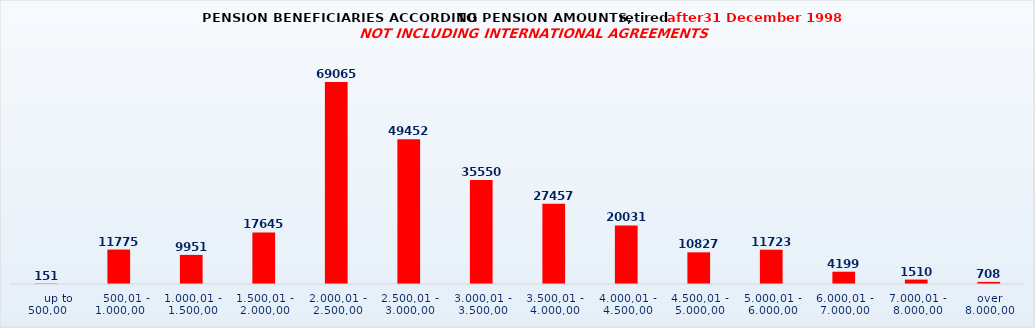
| Category | Series 0 |
|---|---|
|      up to 500,00 | 151 |
|    500,01 - 1.000,00 | 11775 |
| 1.000,01 - 1.500,00 | 9951 |
| 1.500,01 - 2.000,00 | 17645 |
| 2.000,01 - 2.500,00 | 69065 |
| 2.500,01 - 3.000,00 | 49452 |
| 3.000,01 - 3.500,00 | 35550 |
| 3.500,01 - 4.000,00 | 27457 |
| 4.000,01 - 4.500,00 | 20031 |
| 4.500,01 - 5.000,00 | 10827 |
| 5.000,01 - 6.000,00 | 11723 |
| 6.000,01 - 7.000,00 | 4199 |
| 7.000,01 - 8.000,00 | 1510 |
| over 8.000,00 | 708 |